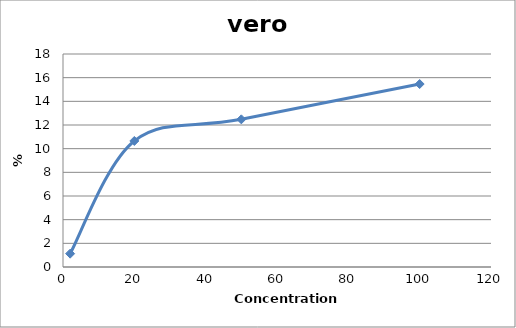
| Category | vero chu2 |
|---|---|
| 100.0 | 15.462 |
| 50.0 | 12.478 |
| 20.0 | 10.651 |
| 2.0 | 1.127 |
| nan | 0 |
| nan | 0 |
| nan | 0 |
| nan | 0 |
| nan | 0 |